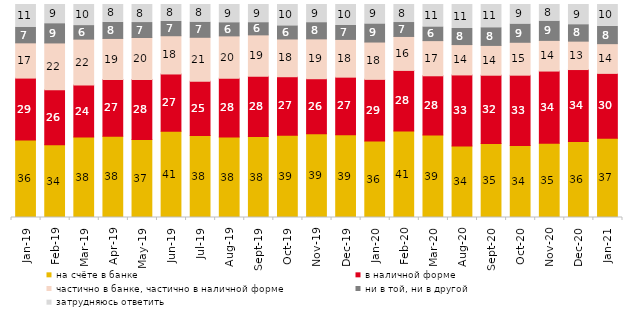
| Category | на счёте в банке | в наличной форме | частично в банке, частично в наличной форме | ни в той, ни в другой | затрудняюсь ответить |
|---|---|---|---|---|---|
| 2019-01-01 | 36.35 | 29.1 | 16.55 | 7.35 | 10.65 |
| 2019-02-01 | 34.2 | 25.75 | 22 | 9.05 | 9 |
| 2019-03-01 | 37.842 | 24.316 | 21.581 | 6.365 | 9.896 |
| 2019-04-01 | 38.119 | 26.634 | 19.307 | 7.574 | 8.366 |
| 2019-05-01 | 36.652 | 28.083 | 19.762 | 7.033 | 8.47 |
| 2019-06-01 | 40.549 | 26.833 | 17.955 | 6.733 | 7.93 |
| 2019-07-01 | 38.465 | 25.495 | 20.644 | 7.129 | 8.267 |
| 2019-08-01 | 37.812 | 27.522 | 19.93 | 6.194 | 8.541 |
| 2019-09-01 | 37.97 | 28.366 | 19.406 | 5.743 | 8.515 |
| 2019-10-01 | 38.663 | 27.426 | 17.723 | 6.188 | 10 |
| 2019-11-01 | 39.356 | 25.792 | 18.713 | 7.624 | 8.515 |
| 2019-12-01 | 38.812 | 27.079 | 17.723 | 6.535 | 9.851 |
| 2020-01-01 | 35.941 | 28.911 | 17.525 | 8.515 | 9.109 |
| 2020-02-01 | 40.644 | 28.416 | 15.941 | 6.535 | 8.465 |
| 2020-03-01 | 38.77 | 27.764 | 16.51 | 6.445 | 10.511 |
| 2020-08-01 | 33.565 | 33.366 | 14.25 | 7.547 | 11.271 |
| 2020-09-01 | 34.744 | 32.056 | 13.987 | 8.313 | 10.901 |
| 2020-10-01 | 33.832 | 32.985 | 15.446 | 8.57 | 9.168 |
| 2020-11-01 | 34.85 | 33.9 | 14.4 | 9.05 | 7.8 |
| 2020-12-01 | 35.647 | 33.813 | 13.337 | 7.734 | 9.47 |
| 2021-01-01 | 37.208 | 30.452 | 13.959 | 8.097 | 10.283 |